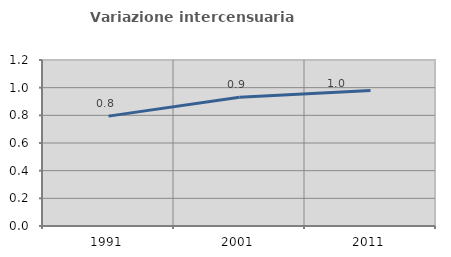
| Category | Variazione intercensuaria annua |
|---|---|
| 1991.0 | 0.794 |
| 2001.0 | 0.93 |
| 2011.0 | 0.98 |